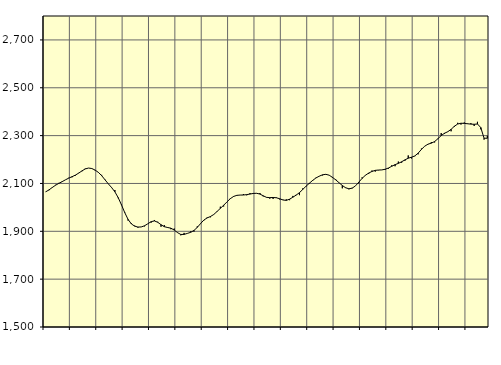
| Category | Piggar | Series 1 |
|---|---|---|
| nan | 2064.3 | 2064.78 |
| 87.0 | 2071.5 | 2073.1 |
| 87.0 | 2081.8 | 2083 |
| 87.0 | 2094.2 | 2092.59 |
| nan | 2102.5 | 2100.34 |
| 88.0 | 2106.4 | 2107.5 |
| 88.0 | 2115.4 | 2115.23 |
| 88.0 | 2123.7 | 2122.23 |
| nan | 2125.8 | 2128.19 |
| 89.0 | 2132.4 | 2134.74 |
| 89.0 | 2144.1 | 2143.06 |
| 89.0 | 2150.8 | 2152.45 |
| nan | 2162.1 | 2160.6 |
| 90.0 | 2164.4 | 2164.49 |
| 90.0 | 2161.6 | 2162.44 |
| 90.0 | 2154.4 | 2155.98 |
| nan | 2147.6 | 2146.3 |
| 91.0 | 2135.9 | 2132.57 |
| 91.0 | 2116.9 | 2115.5 |
| 91.0 | 2098.9 | 2098.54 |
| nan | 2081.7 | 2083.09 |
| 92.0 | 2072.7 | 2065.15 |
| 92.0 | 2038.4 | 2041.03 |
| 92.0 | 2012.4 | 2010.73 |
| nan | 1980.1 | 1978.08 |
| 93.0 | 1945.1 | 1949.94 |
| 93.0 | 1933.8 | 1930.96 |
| 93.0 | 1923.7 | 1921.59 |
| nan | 1915.2 | 1917.77 |
| 94.0 | 1918.5 | 1918.19 |
| 94.0 | 1920.7 | 1923.23 |
| 94.0 | 1931.4 | 1931.52 |
| nan | 1936.2 | 1940.31 |
| 95.0 | 1947.3 | 1943.38 |
| 95.0 | 1939.7 | 1937.77 |
| 95.0 | 1919.2 | 1927.63 |
| nan | 1925.8 | 1919.27 |
| 96.0 | 1914.3 | 1915.89 |
| 96.0 | 1908.7 | 1912.99 |
| 96.0 | 1911.4 | 1905.23 |
| nan | 1893.8 | 1894.56 |
| 97.0 | 1883.3 | 1886.83 |
| 97.0 | 1893.3 | 1887.03 |
| 97.0 | 1891.8 | 1891.23 |
| nan | 1899.6 | 1895.78 |
| 98.0 | 1898.9 | 1903.56 |
| 98.0 | 1920.5 | 1916.37 |
| 98.0 | 1931.3 | 1932.26 |
| nan | 1945.7 | 1947.08 |
| 99.0 | 1958 | 1955.97 |
| 99.0 | 1958.6 | 1961.88 |
| 99.0 | 1970.8 | 1970.31 |
| nan | 1981.7 | 1982.82 |
| 0.0 | 2002.9 | 1995.95 |
| 0.0 | 2003.7 | 2008.91 |
| 0.0 | 2023 | 2022.83 |
| nan | 2037.6 | 2036.16 |
| 1.0 | 2044.1 | 2045.68 |
| 1.0 | 2051.8 | 2050.3 |
| 1.0 | 2051.5 | 2051.45 |
| nan | 2055.7 | 2051.73 |
| 2.0 | 2050.5 | 2053.39 |
| 2.0 | 2059.8 | 2055.71 |
| 2.0 | 2056.1 | 2058.24 |
| nan | 2058.4 | 2058.89 |
| 3.0 | 2060.1 | 2055.67 |
| 3.0 | 2045.9 | 2048.55 |
| 3.0 | 2042.8 | 2041.95 |
| nan | 2036.5 | 2040.7 |
| 4.0 | 2035.4 | 2041.48 |
| 4.0 | 2041.7 | 2040.15 |
| 4.0 | 2033.2 | 2036.1 |
| nan | 2032.1 | 2030.87 |
| 5.0 | 2033.6 | 2029.25 |
| 5.0 | 2030.1 | 2034.21 |
| 5.0 | 2047.9 | 2042.55 |
| nan | 2052.5 | 2051.34 |
| 6.0 | 2051.1 | 2061.63 |
| 6.0 | 2079.3 | 2074.76 |
| 6.0 | 2087.5 | 2088.71 |
| nan | 2098.6 | 2100.88 |
| 7.0 | 2110.6 | 2112.73 |
| 7.0 | 2123.9 | 2122.91 |
| 7.0 | 2131 | 2130.47 |
| nan | 2133.7 | 2136.16 |
| 8.0 | 2137.2 | 2138.22 |
| 8.0 | 2134.8 | 2134.6 |
| 8.0 | 2123.2 | 2125.67 |
| nan | 2117.4 | 2115.01 |
| 9.0 | 2102.9 | 2103.18 |
| 9.0 | 2079.7 | 2091.5 |
| 9.0 | 2083.3 | 2082.04 |
| nan | 2075.6 | 2077.82 |
| 10.0 | 2081.9 | 2080.29 |
| 10.0 | 2090 | 2089.99 |
| 10.0 | 2100.2 | 2105.23 |
| nan | 2125.3 | 2121.22 |
| 11.0 | 2135 | 2134.1 |
| 11.0 | 2139.7 | 2143.43 |
| 11.0 | 2154 | 2150.25 |
| nan | 2149.7 | 2154.74 |
| 12.0 | 2155.2 | 2156.19 |
| 12.0 | 2156.6 | 2156.65 |
| 12.0 | 2156.9 | 2159.47 |
| nan | 2162 | 2164.63 |
| 13.0 | 2176 | 2171.76 |
| 13.0 | 2172 | 2178.63 |
| 13.0 | 2191.5 | 2183.96 |
| nan | 2186.9 | 2190.64 |
| 14.0 | 2195 | 2198.6 |
| 14.0 | 2217.1 | 2205.57 |
| 14.0 | 2204.5 | 2209.85 |
| nan | 2214 | 2215 |
| 15.0 | 2221.8 | 2226.69 |
| 15.0 | 2246 | 2242.36 |
| 15.0 | 2256.1 | 2255.75 |
| nan | 2263.5 | 2264.35 |
| 16.0 | 2273.1 | 2268.52 |
| 16.0 | 2271.5 | 2275.15 |
| 16.0 | 2285.7 | 2286.97 |
| nan | 2310.6 | 2300.26 |
| 17.0 | 2307.1 | 2309.94 |
| 17.0 | 2315.7 | 2316.34 |
| 17.0 | 2318.1 | 2326.17 |
| nan | 2336.3 | 2339.1 |
| 18.0 | 2353.5 | 2348.39 |
| 18.0 | 2346.3 | 2351.78 |
| 18.0 | 2354.9 | 2351.16 |
| nan | 2350.8 | 2349.49 |
| 19.0 | 2352.1 | 2348.09 |
| 19.0 | 2340.3 | 2347.4 |
| 19.0 | 2357.7 | 2348.55 |
| nan | 2326.5 | 2333.85 |
| 20.0 | 2283.4 | 2289.13 |
| 20.0 | 2299.8 | 2288.97 |